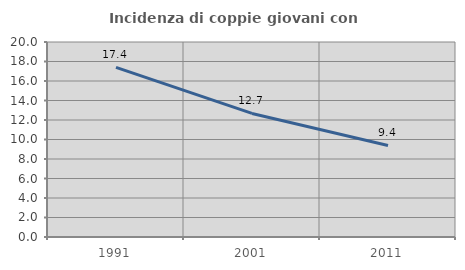
| Category | Incidenza di coppie giovani con figli |
|---|---|
| 1991.0 | 17.391 |
| 2001.0 | 12.672 |
| 2011.0 | 9.39 |